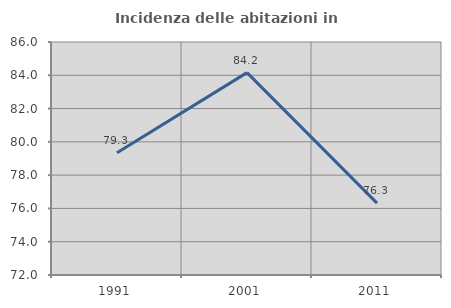
| Category | Incidenza delle abitazioni in proprietà  |
|---|---|
| 1991.0 | 79.343 |
| 2001.0 | 84.158 |
| 2011.0 | 76.316 |